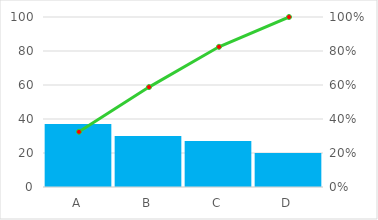
| Category | Series 0 |
|---|---|
| A | 37 |
| B | 30 |
| C | 27 |
| D | 20 |